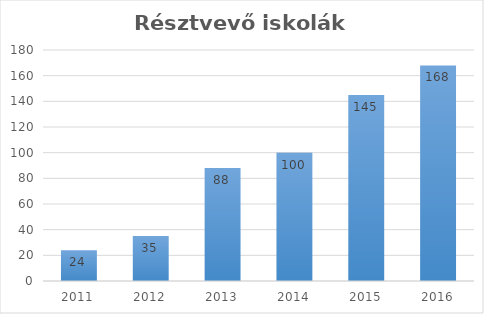
| Category | iskola |
|---|---|
| 2011.0 | 24 |
| 2012.0 | 35 |
| 2013.0 | 88 |
| 2014.0 | 100 |
| 2015.0 | 145 |
| 2016.0 | 168 |